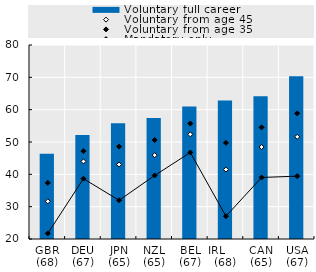
| Category | Voluntary full career |
|---|---|
| GBR (68) | 46.384 |
| DEU (67) | 52.203 |
| JPN (65) | 55.766 |
| NZL (65) | 57.424 |
| BEL (67) | 60.999 |
| IRL      (68) | 62.857 |
| CAN (65) | 64.142 |
| USA (67) | 70.319 |